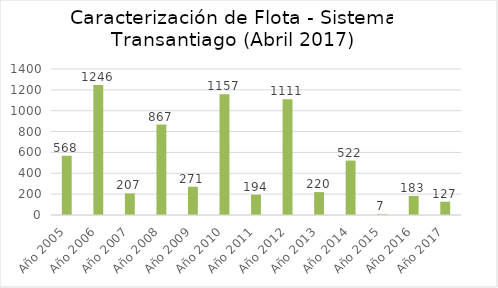
| Category | Series 0 |
|---|---|
| Año 2005 | 568 |
| Año 2006 | 1246 |
| Año 2007 | 207 |
| Año 2008 | 867 |
| Año 2009 | 271 |
| Año 2010 | 1157 |
| Año 2011 | 194 |
| Año 2012 | 1111 |
| Año 2013 | 220 |
| Año 2014 | 522 |
| Año 2015 | 7 |
| Año 2016 | 183 |
| Año 2017 | 127 |